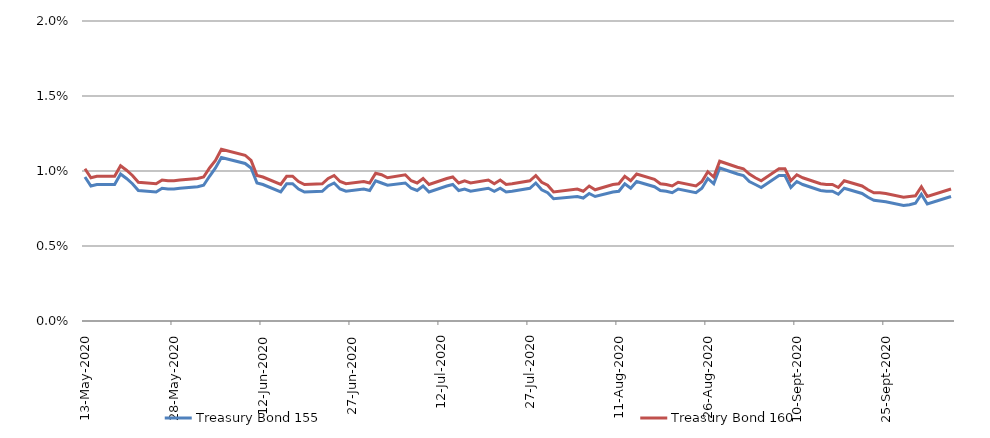
| Category | Treasury Bond 155 | Treasury Bond 160 |
|---|---|---|
| 2020-05-13 | 0.01 | 0.01 |
| 2020-05-14 | 0.009 | 0.01 |
| 2020-05-15 | 0.009 | 0.01 |
| 2020-05-18 | 0.009 | 0.01 |
| 2020-05-19 | 0.01 | 0.01 |
| 2020-05-20 | 0.01 | 0.01 |
| 2020-05-21 | 0.009 | 0.01 |
| 2020-05-22 | 0.009 | 0.009 |
| 2020-05-25 | 0.009 | 0.009 |
| 2020-05-26 | 0.009 | 0.009 |
| 2020-05-27 | 0.009 | 0.009 |
| 2020-05-28 | 0.009 | 0.009 |
| 2020-05-29 | 0.009 | 0.009 |
| 2020-06-01 | 0.009 | 0.01 |
| 2020-06-02 | 0.009 | 0.01 |
| 2020-06-03 | 0.01 | 0.01 |
| 2020-06-04 | 0.01 | 0.011 |
| 2020-06-05 | 0.011 | 0.011 |
| 2020-06-09 | 0.01 | 0.011 |
| 2020-06-10 | 0.01 | 0.011 |
| 2020-06-11 | 0.009 | 0.01 |
| 2020-06-12 | 0.009 | 0.01 |
| 2020-06-15 | 0.009 | 0.009 |
| 2020-06-16 | 0.009 | 0.01 |
| 2020-06-17 | 0.009 | 0.01 |
| 2020-06-18 | 0.009 | 0.009 |
| 2020-06-19 | 0.009 | 0.009 |
| 2020-06-22 | 0.009 | 0.009 |
| 2020-06-23 | 0.009 | 0.01 |
| 2020-06-24 | 0.009 | 0.01 |
| 2020-06-25 | 0.009 | 0.009 |
| 2020-06-26 | 0.009 | 0.009 |
| 2020-06-29 | 0.009 | 0.009 |
| 2020-06-30 | 0.009 | 0.009 |
| 2020-07-01 | 0.009 | 0.01 |
| 2020-07-02 | 0.009 | 0.01 |
| 2020-07-03 | 0.009 | 0.01 |
| 2020-07-06 | 0.009 | 0.01 |
| 2020-07-07 | 0.009 | 0.009 |
| 2020-07-08 | 0.009 | 0.009 |
| 2020-07-09 | 0.009 | 0.01 |
| 2020-07-10 | 0.009 | 0.009 |
| 2020-07-13 | 0.009 | 0.01 |
| 2020-07-14 | 0.009 | 0.01 |
| 2020-07-15 | 0.009 | 0.009 |
| 2020-07-16 | 0.009 | 0.009 |
| 2020-07-17 | 0.009 | 0.009 |
| 2020-07-20 | 0.009 | 0.009 |
| 2020-07-21 | 0.009 | 0.009 |
| 2020-07-22 | 0.009 | 0.009 |
| 2020-07-23 | 0.009 | 0.009 |
| 2020-07-24 | 0.009 | 0.009 |
| 2020-07-27 | 0.009 | 0.009 |
| 2020-07-28 | 0.009 | 0.01 |
| 2020-07-29 | 0.009 | 0.009 |
| 2020-07-30 | 0.009 | 0.009 |
| 2020-07-31 | 0.008 | 0.009 |
| 2020-08-04 | 0.008 | 0.009 |
| 2020-08-05 | 0.008 | 0.009 |
| 2020-08-06 | 0.008 | 0.009 |
| 2020-08-07 | 0.008 | 0.009 |
| 2020-08-10 | 0.009 | 0.009 |
| 2020-08-11 | 0.009 | 0.009 |
| 2020-08-12 | 0.009 | 0.01 |
| 2020-08-13 | 0.009 | 0.009 |
| 2020-08-14 | 0.009 | 0.01 |
| 2020-08-17 | 0.009 | 0.009 |
| 2020-08-18 | 0.009 | 0.009 |
| 2020-08-19 | 0.009 | 0.009 |
| 2020-08-20 | 0.009 | 0.009 |
| 2020-08-21 | 0.009 | 0.009 |
| 2020-08-24 | 0.009 | 0.009 |
| 2020-08-25 | 0.009 | 0.009 |
| 2020-08-26 | 0.01 | 0.01 |
| 2020-08-27 | 0.009 | 0.01 |
| 2020-08-28 | 0.01 | 0.011 |
| 2020-08-31 | 0.01 | 0.01 |
| 2020-09-01 | 0.01 | 0.01 |
| 2020-09-02 | 0.009 | 0.01 |
| 2020-09-03 | 0.009 | 0.01 |
| 2020-09-04 | 0.009 | 0.009 |
| 2020-09-07 | 0.01 | 0.01 |
| 2020-09-08 | 0.01 | 0.01 |
| 2020-09-09 | 0.009 | 0.009 |
| 2020-09-10 | 0.009 | 0.01 |
| 2020-09-11 | 0.009 | 0.01 |
| 2020-09-14 | 0.009 | 0.009 |
| 2020-09-15 | 0.009 | 0.009 |
| 2020-09-16 | 0.009 | 0.009 |
| 2020-09-17 | 0.008 | 0.009 |
| 2020-09-18 | 0.009 | 0.009 |
| 2020-09-21 | 0.008 | 0.009 |
| 2020-09-22 | 0.008 | 0.009 |
| 2020-09-23 | 0.008 | 0.009 |
| 2020-09-24 | 0.008 | 0.009 |
| 2020-09-25 | 0.008 | 0.008 |
| 2020-09-28 | 0.008 | 0.008 |
| 2020-09-29 | 0.008 | 0.008 |
| 2020-09-30 | 0.008 | 0.008 |
| 2020-10-01 | 0.008 | 0.009 |
| 2020-10-02 | 0.008 | 0.008 |
| 2020-10-06 | 0.008 | 0.009 |